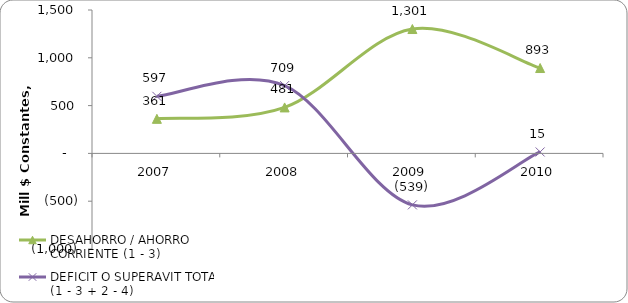
| Category | DESAHORRO / AHORRO CORRIENTE (1 - 3) | DEFICIT O SUPERAVIT TOTAL (1 - 3 + 2 - 4) |
|---|---|---|
| 2007 | 361.442 | 597.116 |
| 2008 | 480.917 | 709.273 |
| 2009 | 1300.974 | -538.547 |
| 2010 | 893 | 15 |